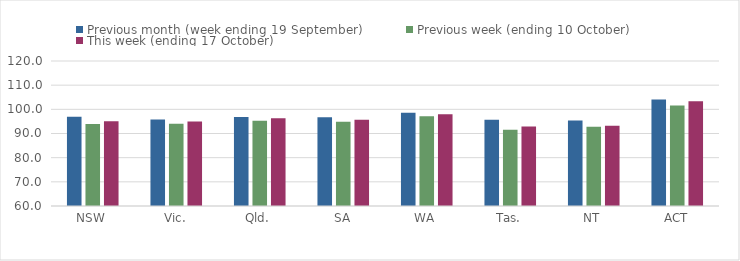
| Category | Previous month (week ending 19 September) | Previous week (ending 10 October) | This week (ending 17 October) |
|---|---|---|---|
| NSW | 96.89 | 93.93 | 95.12 |
| Vic. | 95.77 | 94.05 | 95.01 |
| Qld. | 96.82 | 95.31 | 96.32 |
| SA | 96.76 | 94.86 | 95.68 |
| WA | 98.59 | 97.09 | 97.95 |
| Tas. | 95.64 | 91.54 | 92.85 |
| NT | 95.35 | 92.78 | 93.2 |
| ACT | 104.11 | 101.55 | 103.33 |